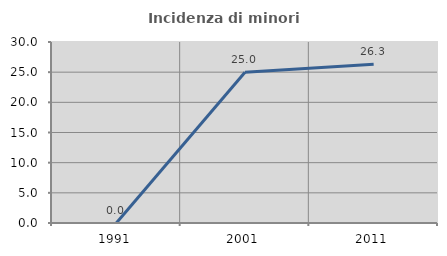
| Category | Incidenza di minori stranieri |
|---|---|
| 1991.0 | 0 |
| 2001.0 | 25 |
| 2011.0 | 26.316 |